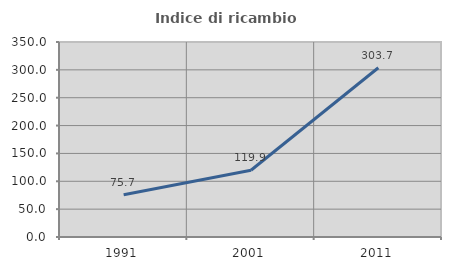
| Category | Indice di ricambio occupazionale  |
|---|---|
| 1991.0 | 75.694 |
| 2001.0 | 119.853 |
| 2011.0 | 303.704 |